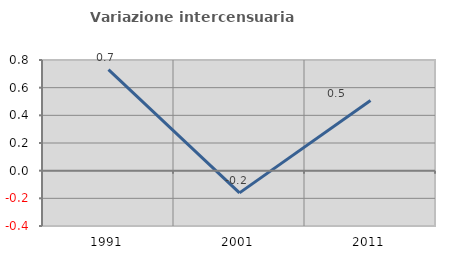
| Category | Variazione intercensuaria annua |
|---|---|
| 1991.0 | 0.73 |
| 2001.0 | -0.161 |
| 2011.0 | 0.507 |